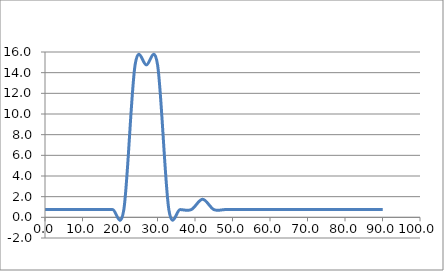
| Category | Elevation (in.) |
|---|---|
| 0.024 | 0.75 |
| 3.024 | 0.75 |
| 6.024 | 0.75 |
| 9.024000000000001 | 0.75 |
| 12.024000000000001 | 0.75 |
| 15.024000000000001 | 0.75 |
| 18.024 | 0.75 |
| 21.024 | 0.75 |
| 24.023999999999997 | 14.75 |
| 27.023999999999997 | 14.75 |
| 30.023999999999997 | 14.75 |
| 33.024 | 0.75 |
| 36.024 | 0.75 |
| 39.024 | 0.75 |
| 42.024 | 1.75 |
| 45.024 | 0.75 |
| 48.024 | 0.75 |
| 51.024 | 0.75 |
| 54.024 | 0.75 |
| 57.024 | 0.75 |
| 60.024 | 0.75 |
| 63.024 | 0.75 |
| 66.024 | 0.75 |
| 69.024 | 0.75 |
| 72.024 | 0.75 |
| 75.024 | 0.75 |
| 78.024 | 0.75 |
| 81.024 | 0.75 |
| 84.024 | 0.75 |
| 87.024 | 0.75 |
| 90.048 | 0.75 |